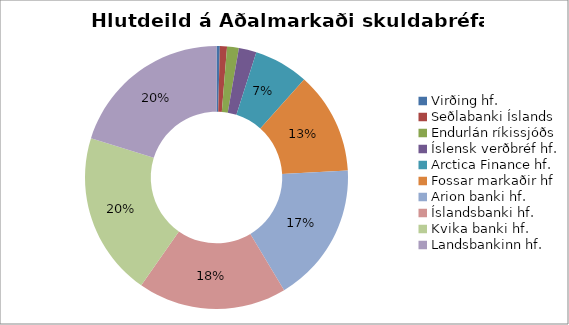
| Category | 2016 |
|---|---|
| Virðing hf. | 0.004 |
| Seðlabanki Íslands | 0.009 |
| Endurlán ríkissjóðs | 0.014 |
| Íslensk verðbréf hf. | 0.022 |
| Arctica Finance hf. | 0.067 |
| Fossar markaðir hf | 0.125 |
| Arion banki hf. | 0.173 |
| Íslandsbanki hf. | 0.183 |
| Kvika banki hf. | 0.201 |
| Landsbankinn hf. | 0.202 |